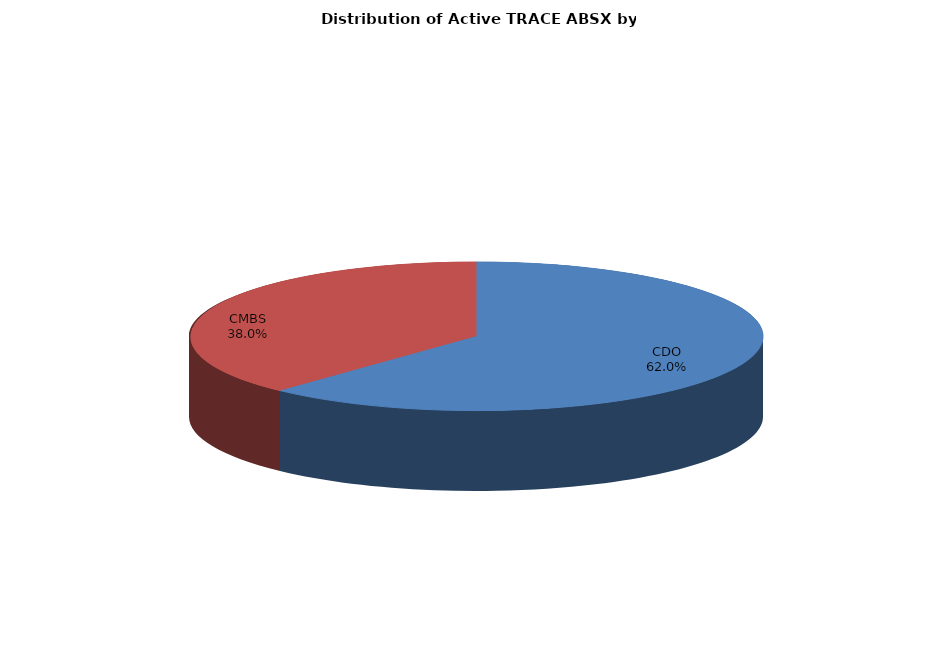
| Category | Series 0 |
|---|---|
| CDO | 36222 |
| CMBS | 22239 |